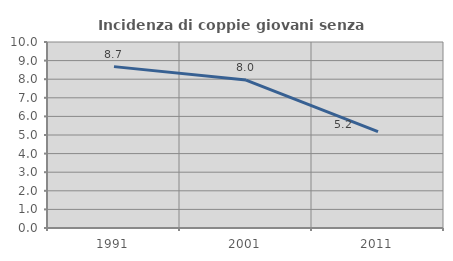
| Category | Incidenza di coppie giovani senza figli |
|---|---|
| 1991.0 | 8.676 |
| 2001.0 | 7.952 |
| 2011.0 | 5.187 |